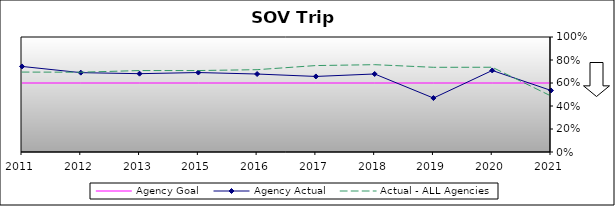
| Category | Agency Goal | Agency Actual | Actual - ALL Agencies |
|---|---|---|---|
| 2011.0 | 0.6 | 0.744 | 0.695 |
| 2012.0 | 0.6 | 0.69 | 0.694 |
| 2013.0 | 0.6 | 0.681 | 0.708 |
| 2015.0 | 0.6 | 0.691 | 0.708 |
| 2016.0 | 0.6 | 0.678 | 0.716 |
| 2017.0 | 0.6 | 0.657 | 0.752 |
| 2018.0 | 0.6 | 0.678 | 0.759 |
| 2019.0 | 0.6 | 0.469 | 0.736 |
| 2020.0 | 0.6 | 0.709 | 0.737 |
| 2021.0 | 0.6 | 0.535 | 0.487 |